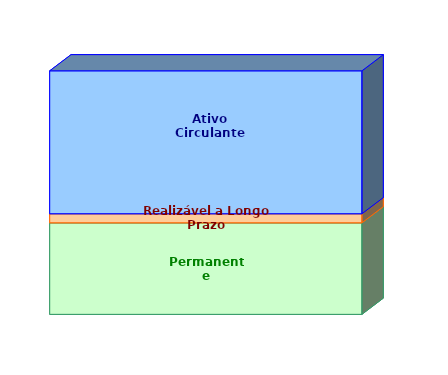
| Category | Permanente | Realizável a Longo Prazo | Ativo Circulante |
|---|---|---|---|
| 0 | 0.376 | 0.037 | 0.587 |